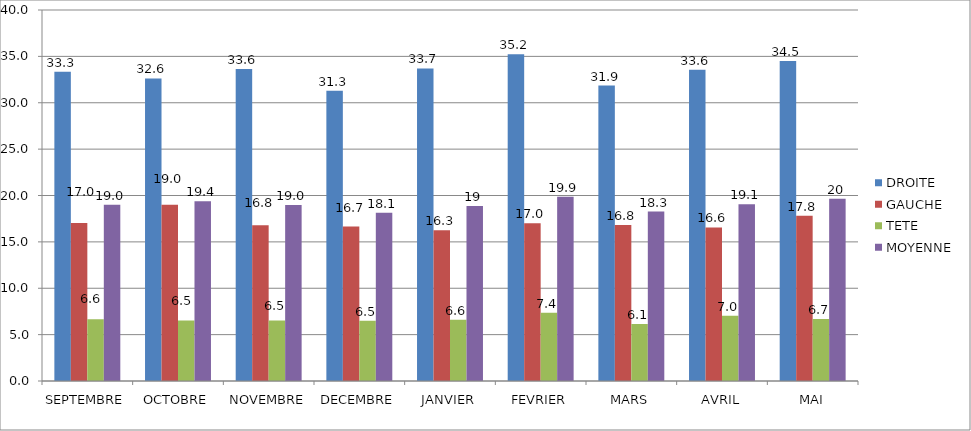
| Category | DROITE | GAUCHE | TETE | MOYENNE |
|---|---|---|---|---|
| SEPTEMBRE | 33.343 | 17.028 | 6.648 | 19.006 |
| OCTOBRE | 32.623 | 19 | 6.536 | 19.386 |
| NOVEMBRE | 33.628 | 16.802 | 6.512 | 18.981 |
| DECEMBRE | 31.283 | 16.66 | 6.491 | 18.145 |
| JANVIER | 33.694 | 16.264 | 6.611 | 18.856 |
| FEVRIER | 35.226 | 17 | 7.371 | 19.866 |
| MARS | 31.852 | 16.815 | 6.148 | 18.272 |
| AVRIL | 33.566 | 16.553 | 7.039 | 19.053 |
| MAI | 34.491 | 17.811 | 6.679 | 19.66 |